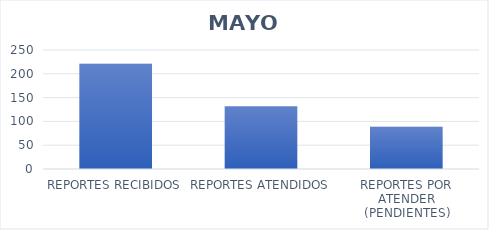
| Category | Series 0 |
|---|---|
| REPORTES RECIBIDOS | 221 |
| REPORTES ATENDIDOS  | 132 |
| REPORTES POR ATENDER (PENDIENTES) | 89 |